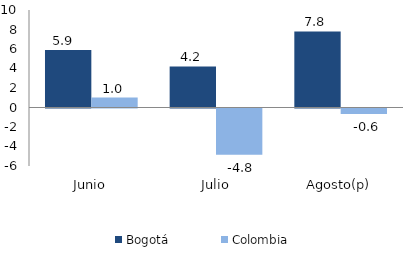
| Category | Bogotá | Colombia |
|---|---|---|
| Junio | 5.906 | 1.02 |
| Julio | 4.216 | -4.753 |
| Agosto(p) | 7.804 | -0.557 |